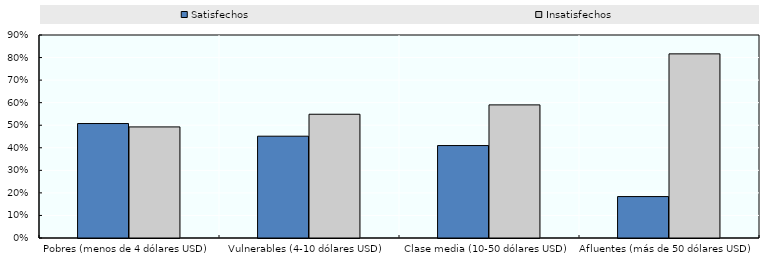
| Category | Satisfechos | Insatisfechos |
|---|---|---|
| Pobres (menos de 4 dólares USD) | 0.507 | 0.493 |
| Vulnerables (4-10 dólares USD) | 0.451 | 0.549 |
| Clase media (10-50 dólares USD) | 0.41 | 0.59 |
| Afluentes (más de 50 dólares USD) | 0.184 | 0.816 |